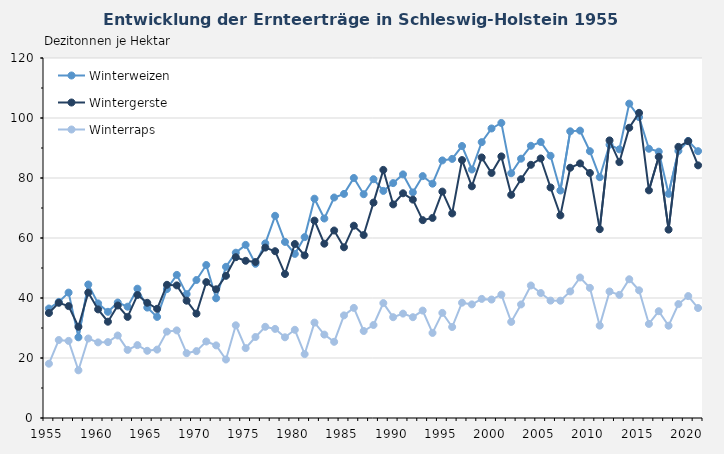
| Category | Winterweizen | Wintergerste | Winterraps |
|---|---|---|---|
| 1955.0 | 36.5 | 35 | 18.1 |
| 1956.0 | 38.7 | 38.4 | 26 |
| 1957.0 | 41.8 | 37.3 | 25.7 |
| 1958.0 | 26.9 | 30.4 | 15.9 |
| 1959.0 | 44.5 | 41.8 | 26.5 |
| 1960.0 | 38.2 | 36.2 | 25.2 |
| 1961.0 | 35.4 | 32.1 | 25.3 |
| 1962.0 | 38.5 | 37.5 | 27.5 |
| 1963.0 | 37.1 | 33.7 | 22.7 |
| 1964.0 | 43.1 | 41 | 24.3 |
| 1965.0 | 36.8 | 38.4 | 22.4 |
| 1966.0 | 33.7 | 36.4 | 22.8 |
| 1967.0 | 43 | 44.4 | 28.8 |
| 1968.0 | 47.7 | 44.2 | 29.2 |
| 1969.0 | 41.3 | 39.1 | 21.6 |
| 1970.0 | 46 | 34.8 | 22.3 |
| 1971.0 | 51 | 45.3 | 25.5 |
| 1972.0 | 39.9 | 42.9 | 24.2 |
| 1973.0 | 50.4 | 47.4 | 19.5 |
| 1974.0 | 55.1 | 53.6 | 30.9 |
| 1975.0 | 57.7 | 52.4 | 23.3 |
| 1976.0 | 51.4 | 52 | 27 |
| 1977.0 | 58.2 | 56.8 | 30.4 |
| 1978.0 | 67.4 | 55.6 | 29.7 |
| 1979.0 | 58.7 | 48 | 26.9 |
| 1980.0 | 54.7 | 58 | 29.4 |
| 1981.0 | 60.3 | 54.2 | 21.3 |
| 1982.0 | 73.1 | 65.8 | 31.8 |
| 1983.0 | 66.5 | 58.1 | 27.8 |
| 1984.0 | 73.5 | 62.5 | 25.4 |
| 1985.0 | 74.7 | 56.9 | 34.2 |
| 1986.0 | 80 | 64.1 | 36.7 |
| 1987.0 | 74.6 | 61 | 29 |
| 1988.0 | 79.6 | 71.8 | 31 |
| 1989.0 | 75.7 | 82.7 | 38.3 |
| 1990.0 | 78.3 | 71.2 | 33.6 |
| 1991.0 | 81.2 | 74.9 | 34.8 |
| 1992.0 | 75.2 | 72.8 | 33.6 |
| 1993.0 | 80.63 | 65.95 | 35.8 |
| 1994.0 | 78.11 | 66.69 | 28.36 |
| 1995.0 | 85.86 | 75.47 | 35.03 |
| 1996.0 | 86.37 | 68.18 | 30.33 |
| 1997.0 | 90.66 | 85.97 | 38.44 |
| 1998.0 | 82.83 | 77.22 | 37.87 |
| 1999.0 | 91.95 | 86.85 | 39.7 |
| 2000.0 | 96.51 | 81.67 | 39.48 |
| 2001.0 | 98.35 | 87.2 | 41.11 |
| 2002.0 | 81.58 | 74.39 | 32.03 |
| 2003.0 | 86.44 | 79.59 | 37.85 |
| 2004.0 | 90.74 | 84.4 | 44.17 |
| 2005.0 | 92.01 | 86.52 | 41.65 |
| 2006.0 | 87.4 | 76.84 | 39.13 |
| 2007.0 | 75.82 | 67.54 | 39.1 |
| 2008.0 | 95.56 | 83.42 | 42.19 |
| 2009.0 | 95.8 | 84.86 | 46.83 |
| 2010.0 | 88.93 | 81.68 | 43.38 |
| 2011.0 | 80.26 | 62.94 | 30.79 |
| 2012.0 | 91.08 | 92.53 | 42.17 |
| 2013.0 | 89.56 | 85.3 | 41.04 |
| 2014.0 | 104.79 | 96.75 | 46.24 |
| 2015.0 | 100.29 | 101.72 | 42.56 |
| 2016.0 | 89.75 | 75.88 | 31.36 |
| 2017.0 | 88.78 | 87.06 | 35.6 |
| 2018.0 | 74.72 | 62.79 | 30.76 |
| 2019.0 | 89.01 | 90.38 | 37.97 |
| 2020.0 | 92.35 | 92.27 | 40.64 |
| 2021.0 | 88.94 | 84.21 | 36.66 |